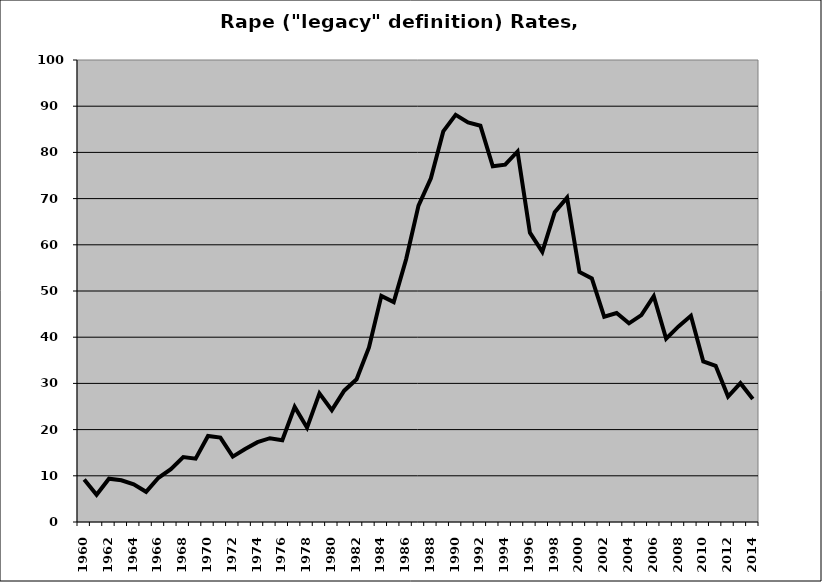
| Category | Rape |
|---|---|
| 1960.0 | 9.187 |
| 1961.0 | 5.895 |
| 1962.0 | 9.382 |
| 1963.0 | 9.034 |
| 1964.0 | 8.147 |
| 1965.0 | 6.535 |
| 1966.0 | 9.57 |
| 1967.0 | 11.45 |
| 1968.0 | 14.045 |
| 1969.0 | 13.704 |
| 1970.0 | 18.61 |
| 1971.0 | 18.28 |
| 1972.0 | 14.159 |
| 1973.0 | 15.799 |
| 1974.0 | 17.277 |
| 1975.0 | 18.135 |
| 1976.0 | 17.698 |
| 1977.0 | 24.914 |
| 1978.0 | 20.412 |
| 1979.0 | 27.835 |
| 1980.0 | 24.211 |
| 1981.0 | 28.428 |
| 1982.0 | 30.897 |
| 1983.0 | 37.789 |
| 1984.0 | 48.94 |
| 1985.0 | 47.588 |
| 1986.0 | 56.872 |
| 1987.0 | 68.478 |
| 1988.0 | 74.394 |
| 1989.0 | 84.547 |
| 1990.0 | 88.116 |
| 1991.0 | 86.471 |
| 1992.0 | 85.776 |
| 1993.0 | 77 |
| 1994.0 | 77.337 |
| 1995.0 | 80.195 |
| 1996.0 | 62.621 |
| 1997.0 | 58.47 |
| 1998.0 | 67.07 |
| 1999.0 | 70.202 |
| 2000.0 | 54.109 |
| 2001.0 | 52.724 |
| 2002.0 | 44.42 |
| 2003.0 | 45.223 |
| 2004.0 | 43.008 |
| 2005.0 | 44.788 |
| 2006.0 | 48.859 |
| 2007.0 | 39.664 |
| 2008.0 | 42.341 |
| 2009.0 | 44.627 |
| 2010.0 | 34.746 |
| 2011.0 | 33.805 |
| 2012.0 | 27.152 |
| 2013.0 | 30.046 |
| 2014.0 | 26.614 |